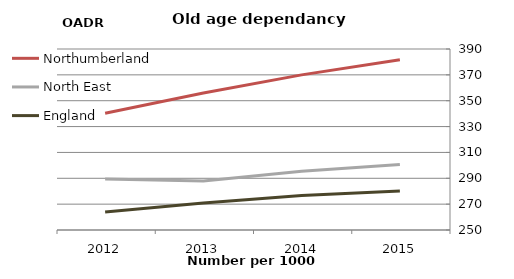
| Category | Northumberland | North East | England |
|---|---|---|---|
| 2015.0 | 381.7 | 300.6 | 280.1 |
| 2014.0 | 370 | 295.4 | 276.6 |
| 2013.0 | 355.9 | 287.9 | 270.8 |
| 2012.0 | 340.3 | 289.4 | 263.9 |